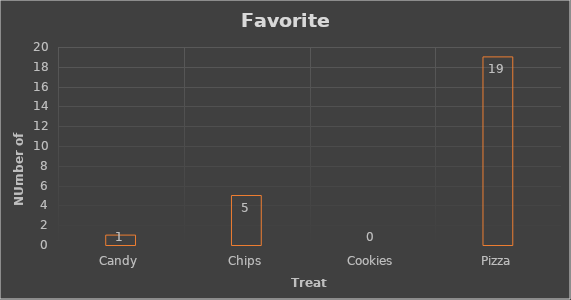
| Category | Number of Votes |
|---|---|
| Candy | 1 |
| Chips | 5 |
| Cookies | 0 |
| Pizza | 19 |